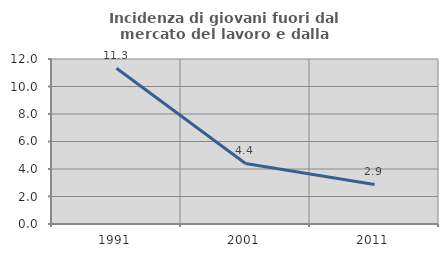
| Category | Incidenza di giovani fuori dal mercato del lavoro e dalla formazione  |
|---|---|
| 1991.0 | 11.328 |
| 2001.0 | 4.405 |
| 2011.0 | 2.874 |